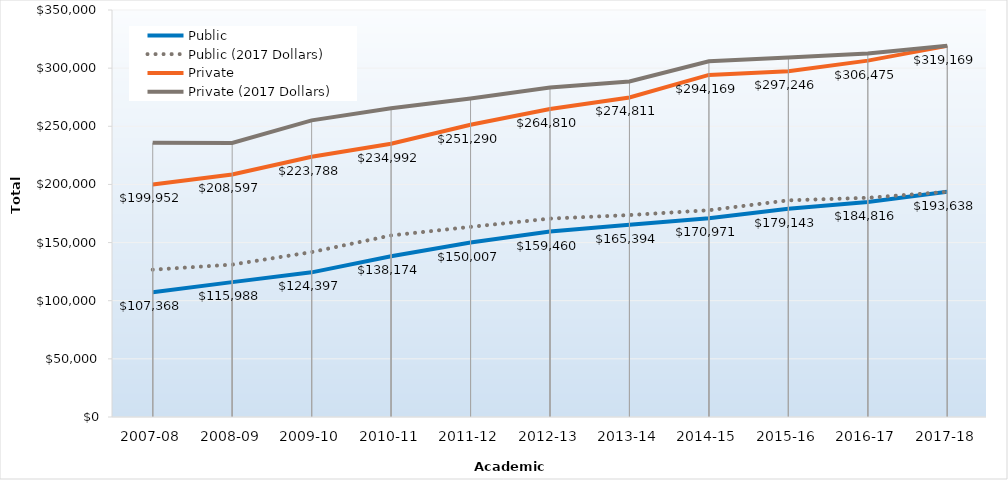
| Category | Public | Public (2017 Dollars) | Private | Private (2017 Dollars) |
|---|---|---|---|---|
| 2007-08 | 107368 | 126694.24 | 199952 | 235943.36 |
| 2008-09 | 115988 | 131066.44 | 208597 | 235714.61 |
| 2009-10 | 124397 | 141812.58 | 223788 | 255118.32 |
| 2010-11 | 138174 | 156136.62 | 234992 | 265540.96 |
| 2011-12 | 150007 | 163507.63 | 251290 | 273906.1 |
| 2012-13 | 159460 | 170622.2 | 264810 | 283346.7 |
| 2013-14 | 165394 | 173663.7 | 274811 | 288551.55 |
| 2014-15 | 170971 | 177809.84 | 294169 | 305935.76 |
| 2015-16 | 179142.68 | 186308.387 | 297246.04 | 309135.882 |
| 2016-17 | 184815.95 | 188512.269 | 306475.19 | 312604.694 |
| 2017-18 | 193638.08 | 193638.08 | 319168.58 | 319168.58 |